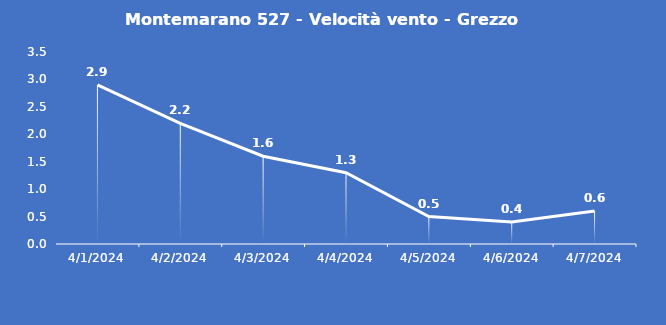
| Category | Montemarano 527 - Velocità vento - Grezzo (m/s) |
|---|---|
| 4/1/24 | 2.9 |
| 4/2/24 | 2.2 |
| 4/3/24 | 1.6 |
| 4/4/24 | 1.3 |
| 4/5/24 | 0.5 |
| 4/6/24 | 0.4 |
| 4/7/24 | 0.6 |